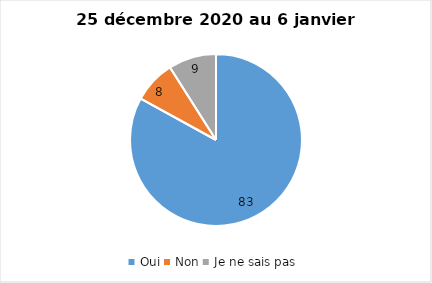
| Category | Series 0 |
|---|---|
| Oui | 83 |
| Non | 8 |
| Je ne sais pas | 9 |